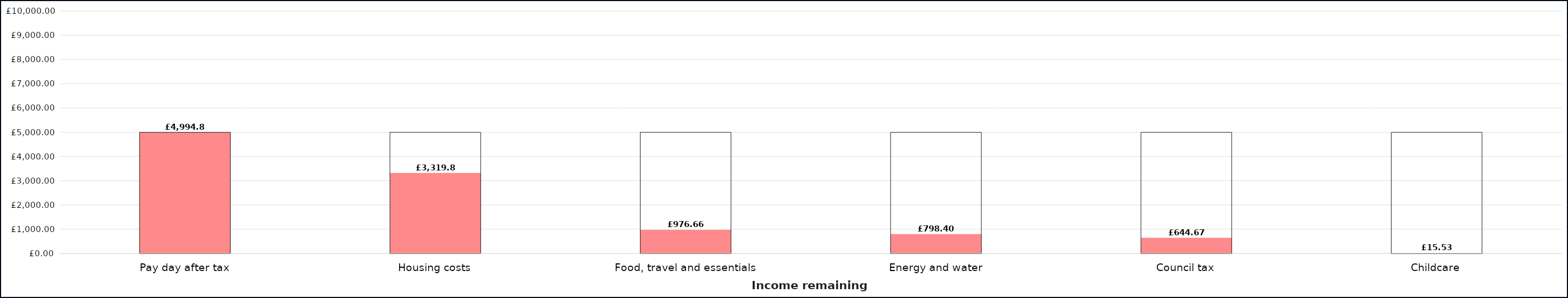
| Category | Money remaining | Income |
|---|---|---|
| Pay day after tax | 4994.797 | 4994.797 |
| Housing costs | 3319.797 | 4994.797 |
| Food, travel and essentials | 976.658 | 4994.797 |
| Energy and water | 798.398 | 4994.797 |
| Council tax | 644.665 | 4994.797 |
| Childcare | 15.534 | 4994.797 |